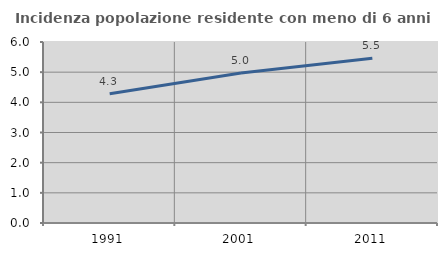
| Category | Incidenza popolazione residente con meno di 6 anni |
|---|---|
| 1991.0 | 4.282 |
| 2001.0 | 4.971 |
| 2011.0 | 5.465 |